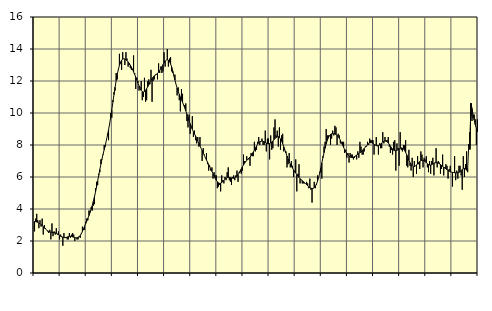
| Category | Piggar | Series 1 |
|---|---|---|
| nan | 2.6 | 3.22 |
| 87.0 | 3.4 | 3.21 |
| 87.0 | 3.7 | 3.19 |
| 87.0 | 3.3 | 3.16 |
| 87.0 | 2.8 | 3.12 |
| 87.0 | 3.3 | 3.08 |
| 87.0 | 2.9 | 3.03 |
| 87.0 | 3.4 | 2.96 |
| 87.0 | 2.4 | 2.9 |
| 87.0 | 3 | 2.82 |
| 87.0 | 2.8 | 2.75 |
| 87.0 | 2.7 | 2.69 |
| nan | 2.6 | 2.64 |
| 88.0 | 2.5 | 2.6 |
| 88.0 | 2.7 | 2.57 |
| 88.0 | 2.1 | 2.56 |
| 88.0 | 3.1 | 2.54 |
| 88.0 | 2.3 | 2.54 |
| 88.0 | 2.6 | 2.52 |
| 88.0 | 2.4 | 2.51 |
| 88.0 | 2.8 | 2.48 |
| 88.0 | 2.4 | 2.44 |
| 88.0 | 2.6 | 2.4 |
| 88.0 | 2.1 | 2.35 |
| nan | 2.4 | 2.3 |
| 89.0 | 2.3 | 2.26 |
| 89.0 | 1.7 | 2.22 |
| 89.0 | 2.5 | 2.21 |
| 89.0 | 2.2 | 2.21 |
| 89.0 | 2.2 | 2.22 |
| 89.0 | 2.1 | 2.25 |
| 89.0 | 2.1 | 2.27 |
| 89.0 | 2.5 | 2.29 |
| 89.0 | 2.2 | 2.3 |
| 89.0 | 2.4 | 2.29 |
| 89.0 | 2.5 | 2.26 |
| nan | 2.4 | 2.24 |
| 90.0 | 2 | 2.21 |
| 90.0 | 2.2 | 2.2 |
| 90.0 | 2.1 | 2.2 |
| 90.0 | 2.1 | 2.22 |
| 90.0 | 2.3 | 2.26 |
| 90.0 | 2.2 | 2.34 |
| 90.0 | 2.5 | 2.46 |
| 90.0 | 2.9 | 2.6 |
| 90.0 | 2.7 | 2.76 |
| 90.0 | 2.7 | 2.92 |
| 90.0 | 3.2 | 3.09 |
| nan | 3.4 | 3.25 |
| 91.0 | 3.3 | 3.42 |
| 91.0 | 3.9 | 3.59 |
| 91.0 | 3.9 | 3.78 |
| 91.0 | 4.1 | 3.98 |
| 91.0 | 3.9 | 4.2 |
| 91.0 | 4.2 | 4.46 |
| 91.0 | 4.3 | 4.74 |
| 91.0 | 5.3 | 5.05 |
| 91.0 | 5.7 | 5.39 |
| 91.0 | 5.5 | 5.75 |
| 91.0 | 6.2 | 6.11 |
| nan | 6.3 | 6.47 |
| 92.0 | 7.1 | 6.81 |
| 92.0 | 7.1 | 7.13 |
| 92.0 | 7.4 | 7.43 |
| 92.0 | 8 | 7.71 |
| 92.0 | 7.9 | 7.99 |
| 92.0 | 8.3 | 8.29 |
| 92.0 | 8.7 | 8.6 |
| 92.0 | 8.3 | 8.95 |
| 92.0 | 9.3 | 9.33 |
| 92.0 | 10 | 9.75 |
| 92.0 | 9.7 | 10.2 |
| nan | 10.8 | 10.68 |
| 93.0 | 11.3 | 11.15 |
| 93.0 | 11.4 | 11.61 |
| 93.0 | 12.5 | 12.03 |
| 93.0 | 12.1 | 12.41 |
| 93.0 | 12.7 | 12.72 |
| 93.0 | 13.7 | 12.98 |
| 93.0 | 13.1 | 13.17 |
| 93.0 | 12.7 | 13.3 |
| 93.0 | 13.8 | 13.37 |
| 93.0 | 13.4 | 13.39 |
| 93.0 | 13 | 13.37 |
| nan | 13.8 | 13.33 |
| 94.0 | 13.4 | 13.27 |
| 94.0 | 12.9 | 13.19 |
| 94.0 | 13 | 13.1 |
| 94.0 | 12.8 | 12.99 |
| 94.0 | 12.7 | 12.87 |
| 94.0 | 12.7 | 12.73 |
| 94.0 | 13.6 | 12.57 |
| 94.0 | 12.5 | 12.41 |
| 94.0 | 11.5 | 12.24 |
| 94.0 | 12.2 | 12.06 |
| 94.0 | 12 | 11.88 |
| nan | 11.4 | 11.7 |
| 95.0 | 11.6 | 11.54 |
| 95.0 | 12 | 11.41 |
| 95.0 | 10.8 | 11.34 |
| 95.0 | 11 | 11.31 |
| 95.0 | 12.2 | 11.34 |
| 95.0 | 10.7 | 11.41 |
| 95.0 | 10.8 | 11.52 |
| 95.0 | 12 | 11.64 |
| 95.0 | 12.1 | 11.77 |
| 95.0 | 11.8 | 11.91 |
| 95.0 | 12.7 | 12.04 |
| nan | 10.7 | 12.15 |
| 96.0 | 12 | 12.24 |
| 96.0 | 12.1 | 12.32 |
| 96.0 | 12.4 | 12.37 |
| 96.0 | 12.4 | 12.42 |
| 96.0 | 12.1 | 12.48 |
| 96.0 | 13.1 | 12.55 |
| 96.0 | 12.5 | 12.65 |
| 96.0 | 12.9 | 12.77 |
| 96.0 | 12.5 | 12.89 |
| 96.0 | 12.6 | 13.02 |
| 96.0 | 13.8 | 13.14 |
| nan | 12.9 | 13.24 |
| 97.0 | 13.3 | 13.3 |
| 97.0 | 14 | 13.33 |
| 97.0 | 12.9 | 13.3 |
| 97.0 | 13.4 | 13.22 |
| 97.0 | 13.5 | 13.07 |
| 97.0 | 12.6 | 12.87 |
| 97.0 | 12.5 | 12.62 |
| 97.0 | 12.3 | 12.34 |
| 97.0 | 12.4 | 12.06 |
| 97.0 | 11.8 | 11.8 |
| 97.0 | 11.1 | 11.56 |
| nan | 11.6 | 11.35 |
| 98.0 | 10.8 | 11.16 |
| 98.0 | 10.1 | 11 |
| 98.0 | 11.5 | 10.83 |
| 98.0 | 11.2 | 10.67 |
| 98.0 | 10.5 | 10.5 |
| 98.0 | 10.5 | 10.32 |
| 98.0 | 10.6 | 10.13 |
| 98.0 | 9.5 | 9.93 |
| 98.0 | 9.1 | 9.73 |
| 98.0 | 9.9 | 9.52 |
| 98.0 | 8.7 | 9.33 |
| nan | 9.2 | 9.15 |
| 99.0 | 9.8 | 8.98 |
| 99.0 | 8.5 | 8.83 |
| 99.0 | 8.9 | 8.69 |
| 99.0 | 8.3 | 8.55 |
| 99.0 | 8.1 | 8.4 |
| 99.0 | 8.5 | 8.25 |
| 99.0 | 7.9 | 8.1 |
| 99.0 | 8.5 | 7.95 |
| 99.0 | 7.8 | 7.8 |
| 99.0 | 7 | 7.66 |
| 99.0 | 7.8 | 7.51 |
| nan | 7.4 | 7.36 |
| 0.0 | 7.2 | 7.21 |
| 0.0 | 7.5 | 7.06 |
| 0.0 | 6.8 | 6.92 |
| 0.0 | 6.4 | 6.78 |
| 0.0 | 6.7 | 6.64 |
| 0.0 | 6.4 | 6.5 |
| 0.0 | 6.6 | 6.35 |
| 0.0 | 5.9 | 6.21 |
| 0.0 | 6.3 | 6.06 |
| 0.0 | 6.1 | 5.92 |
| 0.0 | 6.1 | 5.8 |
| nan | 5.3 | 5.7 |
| 1.0 | 5.4 | 5.63 |
| 1.0 | 5.5 | 5.6 |
| 1.0 | 5.1 | 5.61 |
| 1.0 | 6.1 | 5.65 |
| 1.0 | 5.8 | 5.72 |
| 1.0 | 5.6 | 5.79 |
| 1.0 | 6 | 5.87 |
| 1.0 | 5.8 | 5.92 |
| 1.0 | 6.3 | 5.96 |
| 1.0 | 6.6 | 5.98 |
| 1.0 | 5.8 | 5.97 |
| nan | 5.7 | 5.96 |
| 2.0 | 5.5 | 5.94 |
| 2.0 | 6 | 5.93 |
| 2.0 | 6.1 | 5.92 |
| 2.0 | 5.8 | 5.94 |
| 2.0 | 6.1 | 5.98 |
| 2.0 | 6.4 | 6.04 |
| 2.0 | 5.7 | 6.14 |
| 2.0 | 6.3 | 6.25 |
| 2.0 | 6.3 | 6.38 |
| 2.0 | 6.2 | 6.51 |
| 2.0 | 6.4 | 6.64 |
| nan | 7.4 | 6.75 |
| 3.0 | 7 | 6.86 |
| 3.0 | 7 | 6.96 |
| 3.0 | 7.3 | 7.04 |
| 3.0 | 7.1 | 7.11 |
| 3.0 | 7.1 | 7.18 |
| 3.0 | 6.7 | 7.25 |
| 3.0 | 7.5 | 7.33 |
| 3.0 | 7.3 | 7.43 |
| 3.0 | 7.3 | 7.55 |
| 3.0 | 8.2 | 7.68 |
| 3.0 | 7.6 | 7.82 |
| nan | 7.7 | 7.94 |
| 4.0 | 8.2 | 8.05 |
| 4.0 | 8.5 | 8.14 |
| 4.0 | 8 | 8.2 |
| 4.0 | 8.2 | 8.23 |
| 4.0 | 8.4 | 8.25 |
| 4.0 | 8 | 8.23 |
| 4.0 | 8 | 8.2 |
| 4.0 | 8.9 | 8.16 |
| 4.0 | 7.6 | 8.12 |
| 4.0 | 8.4 | 8.09 |
| 4.0 | 8.4 | 8.08 |
| nan | 7.1 | 8.09 |
| 5.0 | 8.6 | 8.13 |
| 5.0 | 7.7 | 8.18 |
| 5.0 | 7.8 | 8.25 |
| 5.0 | 9.1 | 8.33 |
| 5.0 | 9.6 | 8.41 |
| 5.0 | 8.6 | 8.48 |
| 5.0 | 8.9 | 8.52 |
| 5.0 | 7.9 | 8.52 |
| 5.0 | 9.1 | 8.47 |
| 5.0 | 7.7 | 8.38 |
| 5.0 | 8.6 | 8.24 |
| nan | 8.7 | 8.08 |
| 6.0 | 7.6 | 7.89 |
| 6.0 | 7.7 | 7.69 |
| 6.0 | 7.6 | 7.5 |
| 6.0 | 6.6 | 7.31 |
| 6.0 | 6.8 | 7.13 |
| 6.0 | 7.5 | 6.96 |
| 6.0 | 6.6 | 6.81 |
| 6.0 | 7 | 6.67 |
| 6.0 | 6.7 | 6.56 |
| 6.0 | 6 | 6.45 |
| 6.0 | 6.3 | 6.35 |
| nan | 7.1 | 6.25 |
| 7.0 | 5.1 | 6.15 |
| 7.0 | 6.2 | 6.06 |
| 7.0 | 6.8 | 5.97 |
| 7.0 | 5.6 | 5.89 |
| 7.0 | 5.8 | 5.83 |
| 7.0 | 5.6 | 5.77 |
| 7.0 | 5.6 | 5.71 |
| 7.0 | 5.6 | 5.66 |
| 7.0 | 5.6 | 5.59 |
| 7.0 | 5.7 | 5.52 |
| 7.0 | 5.6 | 5.45 |
| nan | 5.3 | 5.38 |
| 8.0 | 5.9 | 5.33 |
| 8.0 | 5.2 | 5.3 |
| 8.0 | 4.4 | 5.28 |
| 8.0 | 5.3 | 5.29 |
| 8.0 | 5.7 | 5.33 |
| 8.0 | 5.3 | 5.42 |
| 8.0 | 5.5 | 5.55 |
| 8.0 | 6.1 | 5.73 |
| 8.0 | 6 | 5.96 |
| 8.0 | 6.3 | 6.24 |
| 8.0 | 6.3 | 6.55 |
| nan | 5.9 | 6.88 |
| 9.0 | 7.3 | 7.21 |
| 9.0 | 7.9 | 7.52 |
| 9.0 | 8.2 | 7.81 |
| 9.0 | 9 | 8.07 |
| 9.0 | 8.6 | 8.29 |
| 9.0 | 8.6 | 8.45 |
| 9.0 | 8.6 | 8.58 |
| 9.0 | 8 | 8.66 |
| 9.0 | 8.4 | 8.7 |
| 9.0 | 8.9 | 8.71 |
| 9.0 | 8.6 | 8.7 |
| nan | 9.2 | 8.69 |
| 10.0 | 9.1 | 8.66 |
| 10.0 | 8 | 8.6 |
| 10.0 | 8.7 | 8.53 |
| 10.0 | 8.6 | 8.43 |
| 10.0 | 8.1 | 8.3 |
| 10.0 | 8.1 | 8.15 |
| 10.0 | 8.2 | 8 |
| 10.0 | 8.2 | 7.85 |
| 10.0 | 7.5 | 7.71 |
| 10.0 | 7.7 | 7.59 |
| 10.0 | 7.2 | 7.48 |
| nan | 7.5 | 7.38 |
| 11.0 | 6.9 | 7.3 |
| 11.0 | 7.5 | 7.25 |
| 11.0 | 7.4 | 7.22 |
| 11.0 | 7.4 | 7.22 |
| 11.0 | 7.1 | 7.24 |
| 11.0 | 7.2 | 7.28 |
| 11.0 | 7.3 | 7.32 |
| 11.0 | 7.1 | 7.37 |
| 11.0 | 7.6 | 7.42 |
| 11.0 | 7.2 | 7.46 |
| 11.0 | 8.2 | 7.51 |
| nan | 7.9 | 7.57 |
| 12.0 | 7.4 | 7.63 |
| 12.0 | 7.4 | 7.71 |
| 12.0 | 7.6 | 7.79 |
| 12.0 | 7.9 | 7.87 |
| 12.0 | 7.9 | 7.94 |
| 12.0 | 8.2 | 8.02 |
| 12.0 | 8 | 8.08 |
| 12.0 | 8.4 | 8.13 |
| 12.0 | 8.3 | 8.15 |
| 12.0 | 8.3 | 8.14 |
| 12.0 | 8.3 | 8.11 |
| nan | 7.4 | 8.05 |
| 13.0 | 8 | 8 |
| 13.0 | 8.5 | 7.96 |
| 13.0 | 8 | 7.95 |
| 13.0 | 7.4 | 7.96 |
| 13.0 | 8.1 | 8 |
| 13.0 | 7.8 | 8.06 |
| 13.0 | 7.8 | 8.13 |
| 13.0 | 8.8 | 8.19 |
| 13.0 | 8.1 | 8.23 |
| 13.0 | 8.5 | 8.25 |
| 13.0 | 8.3 | 8.24 |
| nan | 8.3 | 8.2 |
| 14.0 | 8.5 | 8.13 |
| 14.0 | 7.9 | 8.04 |
| 14.0 | 7.5 | 7.93 |
| 14.0 | 7.7 | 7.83 |
| 14.0 | 7.4 | 7.74 |
| 14.0 | 8.2 | 7.68 |
| 14.0 | 8.3 | 7.64 |
| 14.0 | 6.4 | 7.64 |
| 14.0 | 8.1 | 7.67 |
| 14.0 | 7.8 | 7.71 |
| 14.0 | 6.7 | 7.76 |
| nan | 8.8 | 7.8 |
| 15.0 | 7.7 | 7.82 |
| 15.0 | 7.6 | 7.8 |
| 15.0 | 8 | 7.75 |
| 15.0 | 8 | 7.67 |
| 15.0 | 8.3 | 7.54 |
| 15.0 | 6.7 | 7.39 |
| 15.0 | 6.6 | 7.22 |
| 15.0 | 7.7 | 7.05 |
| 15.0 | 6.7 | 6.9 |
| 15.0 | 6.4 | 6.78 |
| 15.0 | 7.2 | 6.7 |
| nan | 6 | 6.66 |
| 16.0 | 7 | 6.65 |
| 16.0 | 6.7 | 6.69 |
| 16.0 | 6.2 | 6.75 |
| 16.0 | 7.3 | 6.82 |
| 16.0 | 6.8 | 6.9 |
| 16.0 | 6.5 | 6.97 |
| 16.0 | 7.6 | 7.02 |
| 16.0 | 7.4 | 7.05 |
| 16.0 | 6.6 | 7.05 |
| 16.0 | 7.2 | 7.01 |
| 16.0 | 7.1 | 6.96 |
| nan | 7.3 | 6.89 |
| 17.0 | 6.6 | 6.83 |
| 17.0 | 6.3 | 6.78 |
| 17.0 | 7 | 6.75 |
| 17.0 | 6.2 | 6.75 |
| 17.0 | 7 | 6.77 |
| 17.0 | 7.2 | 6.81 |
| 17.0 | 6.1 | 6.85 |
| 17.0 | 6.9 | 6.88 |
| 17.0 | 7.8 | 6.89 |
| 17.0 | 6.6 | 6.89 |
| 17.0 | 7 | 6.87 |
| nan | 6.9 | 6.83 |
| 18.0 | 6.2 | 6.78 |
| 18.0 | 6.5 | 6.72 |
| 18.0 | 7.4 | 6.67 |
| 18.0 | 6.1 | 6.61 |
| 18.0 | 6.6 | 6.56 |
| 18.0 | 6.8 | 6.51 |
| 18.0 | 6.7 | 6.46 |
| 18.0 | 5.9 | 6.42 |
| 18.0 | 6.5 | 6.37 |
| 18.0 | 6.7 | 6.33 |
| 18.0 | 6.3 | 6.31 |
| nan | 5.4 | 6.29 |
| 19.0 | 6.3 | 6.28 |
| 19.0 | 7.3 | 6.27 |
| 19.0 | 5.8 | 6.26 |
| 19.0 | 6.4 | 6.26 |
| 19.0 | 5.9 | 6.27 |
| 19.0 | 6.7 | 6.29 |
| 19.0 | 6.7 | 6.34 |
| 19.0 | 6.1 | 6.4 |
| 19.0 | 5.2 | 6.47 |
| 19.0 | 7.3 | 6.52 |
| 19.0 | 6 | 6.54 |
| nan | 6.8 | 6.51 |
| 20.0 | 7.6 | 6.42 |
| 20.0 | 6.3 | 6.53 |
| 20.0 | 8 | 8.03 |
| 20.0 | 8.8 | 7.73 |
| 20.0 | 9.8 | 10.61 |
| 20.0 | 9.5 | 10.25 |
| 20.0 | 9.7 | 9.89 |
| 20.0 | 9.9 | 9.56 |
| 20.0 | 9.6 | 9.27 |
| 20.0 | 8 | 9.03 |
| 20.0 | 9.6 | 8.84 |